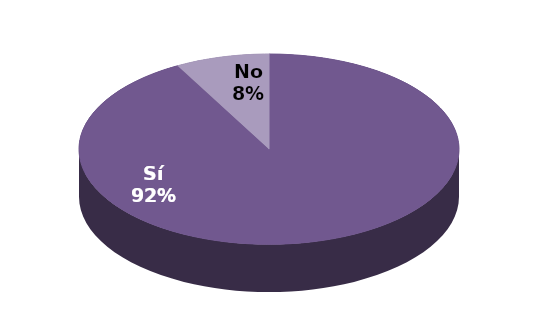
| Category | Series 1 |
|---|---|
| Sí | 23 |
| No | 2 |